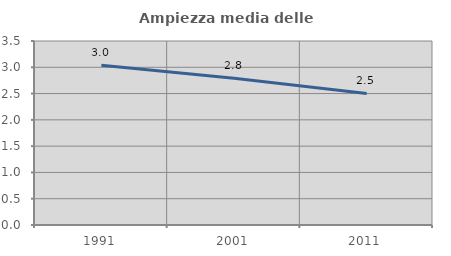
| Category | Ampiezza media delle famiglie |
|---|---|
| 1991.0 | 3.038 |
| 2001.0 | 2.793 |
| 2011.0 | 2.502 |